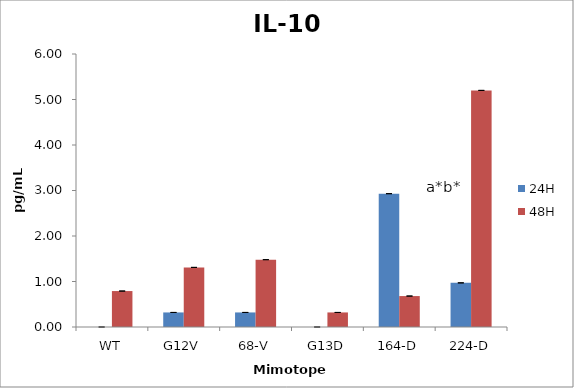
| Category | 24H | 48H |
|---|---|---|
| WT | 0 | 0.79 |
| G12V | 0.32 | 1.31 |
| 68-V | 0.32 | 1.48 |
| G13D | 0 | 0.32 |
| 164-D | 2.93 | 0.68 |
| 224-D | 0.97 | 5.2 |